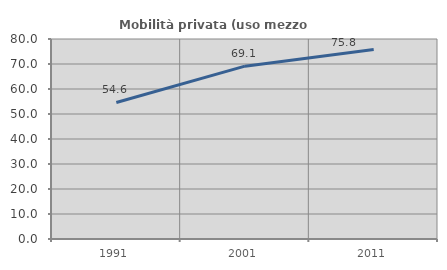
| Category | Mobilità privata (uso mezzo privato) |
|---|---|
| 1991.0 | 54.624 |
| 2001.0 | 69.132 |
| 2011.0 | 75.814 |